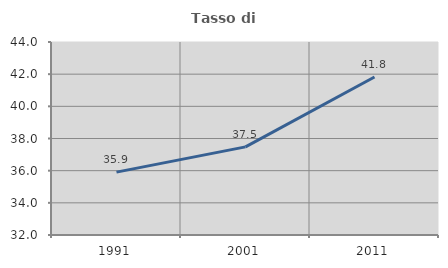
| Category | Tasso di occupazione   |
|---|---|
| 1991.0 | 35.909 |
| 2001.0 | 37.481 |
| 2011.0 | 41.824 |